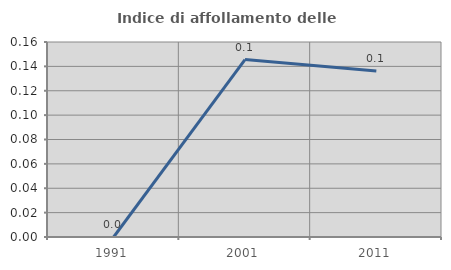
| Category | Indice di affollamento delle abitazioni  |
|---|---|
| 1991.0 | 0 |
| 2001.0 | 0.146 |
| 2011.0 | 0.136 |